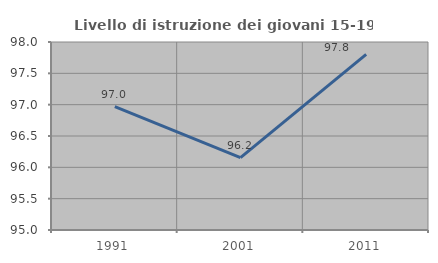
| Category | Livello di istruzione dei giovani 15-19 anni |
|---|---|
| 1991.0 | 96.97 |
| 2001.0 | 96.154 |
| 2011.0 | 97.802 |